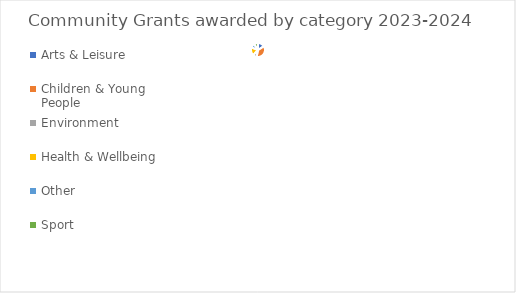
| Category | Series 0 |
|---|---|
| Arts & Leisure | 7450 |
| Children & Young People | 17701 |
| Environment | 4278 |
| Health & Wellbeing | 8990 |
| Other | 4598 |
| Sport | 4415 |